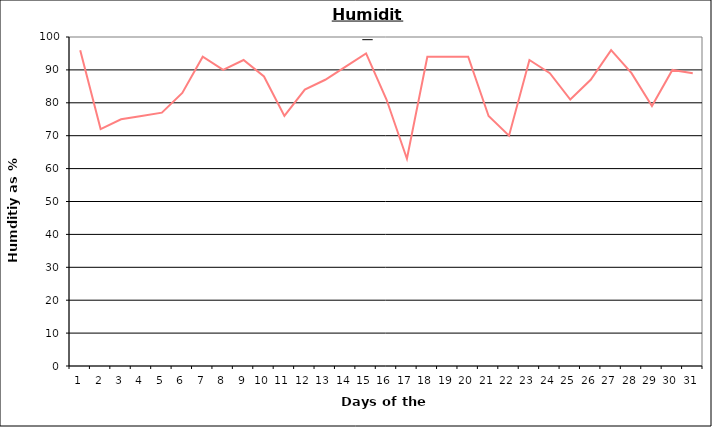
| Category | Series 0 |
|---|---|
| 0 | 96 |
| 1 | 72 |
| 2 | 75 |
| 3 | 76 |
| 4 | 77 |
| 5 | 83 |
| 6 | 94 |
| 7 | 90 |
| 8 | 93 |
| 9 | 88 |
| 10 | 76 |
| 11 | 84 |
| 12 | 87 |
| 13 | 91 |
| 14 | 95 |
| 15 | 81 |
| 16 | 63 |
| 17 | 94 |
| 18 | 94 |
| 19 | 94 |
| 20 | 76 |
| 21 | 70 |
| 22 | 93 |
| 23 | 89 |
| 24 | 81 |
| 25 | 87 |
| 26 | 96 |
| 27 | 89 |
| 28 | 79 |
| 29 | 90 |
| 30 | 89 |